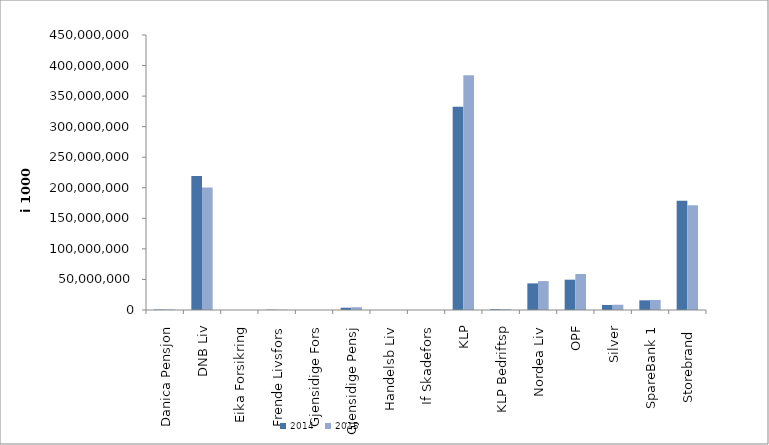
| Category | 2014 | 2015 |
|---|---|---|
| Danica Pensjon | 787946.613 | 871760.159 |
| DNB Liv | 219089384 | 200578226 |
| Eika Forsikring | 0 | 0 |
| Frende Livsfors | 541027 | 423685 |
| Gjensidige Fors | 0 | 0 |
| Gjensidige Pensj | 3764162.206 | 4584145.583 |
| Handelsb Liv | 23758 | 28340 |
| If Skadefors | 0 | 0 |
| KLP | 332433481.117 | 383972113.197 |
| KLP Bedriftsp | 1220615 | 1331683 |
| Nordea Liv | 43528540.815 | 47330176.08 |
| OPF | 49590103 | 58892941 |
| Silver | 8269977.148 | 8603713.236 |
| SpareBank 1 | 15849447.236 | 16425734.104 |
| Storebrand  | 178700457.461 | 171234150.406 |